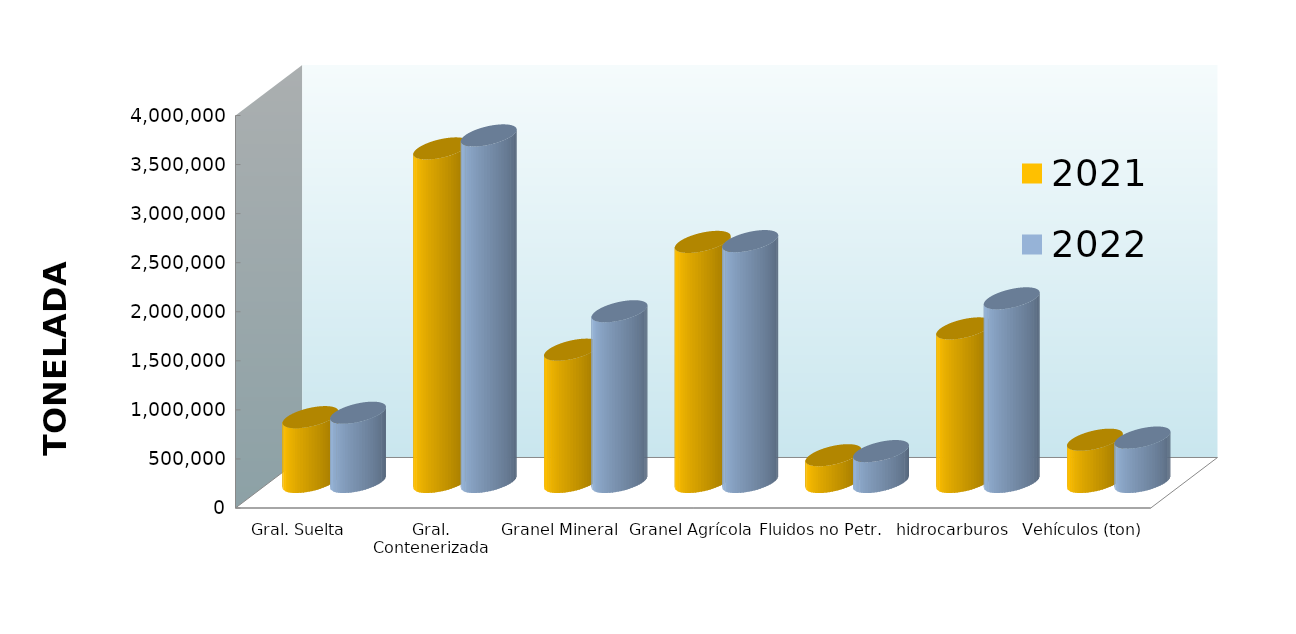
| Category | 2021 | 2022 |
|---|---|---|
| Gral. Suelta | 660792.792 | 705818.576 |
| Gral. Contenerizada | 3399410.822 | 3532112.67 |
| Granel Mineral | 1348387.744 | 1740165.196 |
| Granel Agrícola | 2446792.764 | 2454891.901 |
| Fluidos no Petr. | 272856.405 | 314893.749 |
| hidrocarburos | 1565145.902 | 1871605.442 |
| Vehículos (ton) | 430779.08 | 452872.703 |